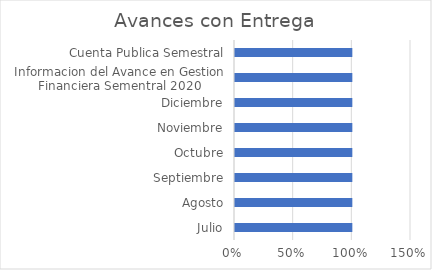
| Category | Series 0 |
|---|---|
| Julio | 1 |
| Agosto | 1 |
| Septiembre | 1 |
| Octubre | 1 |
| Noviembre | 1 |
| Diciembre | 1 |
| Informacion del Avance en Gestion Financiera Sementral 2020 | 1 |
| Cuenta Publica Semestral | 1 |